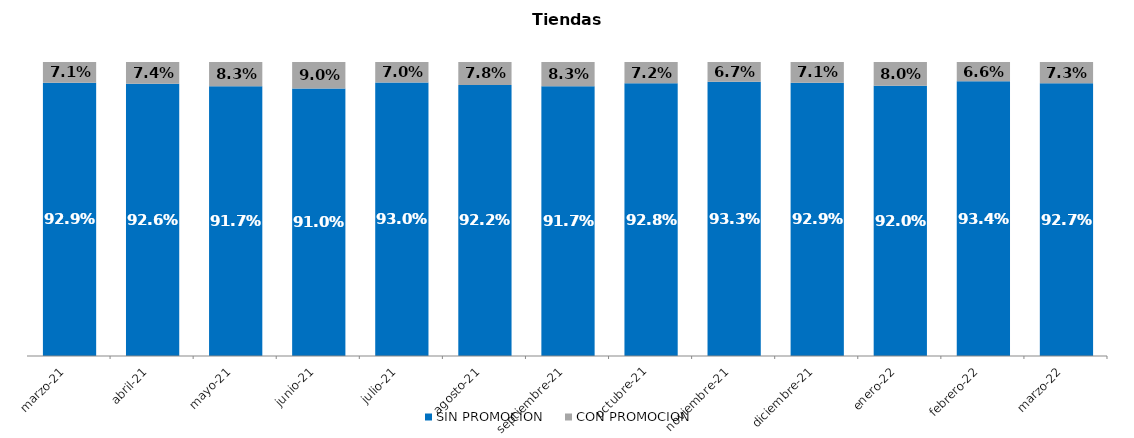
| Category | SIN PROMOCION   | CON PROMOCION   |
|---|---|---|
| 2021-03-01 | 0.929 | 0.071 |
| 2021-04-01 | 0.926 | 0.074 |
| 2021-05-01 | 0.917 | 0.083 |
| 2021-06-01 | 0.91 | 0.09 |
| 2021-07-01 | 0.93 | 0.07 |
| 2021-08-01 | 0.922 | 0.078 |
| 2021-09-01 | 0.917 | 0.083 |
| 2021-10-01 | 0.928 | 0.072 |
| 2021-11-01 | 0.933 | 0.067 |
| 2021-12-01 | 0.929 | 0.071 |
| 2022-01-01 | 0.92 | 0.08 |
| 2022-02-01 | 0.934 | 0.066 |
| 2022-03-01 | 0.927 | 0.073 |